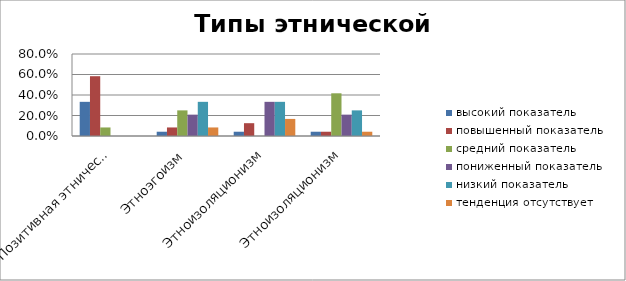
| Category | высокий показатель | повышенный показатель | средний показатель | пониженный показатель | низкий показатель | тенденция отсутствует |
|---|---|---|---|---|---|---|
| Позитивная этническая идентичность | 0.333 | 0.583 | 0.083 | 0 | 0 | 0 |
| Этноэгоизм | 0.042 | 0.083 | 0.25 | 0.208 | 0.333 | 0.083 |
| Этноизоляционизм | 0.042 | 0.125 | 0 | 0.333 | 0.333 | 0.167 |
| Этноизоляционизм | 0.042 | 0.042 | 0.417 | 0.208 | 0.25 | 0.042 |